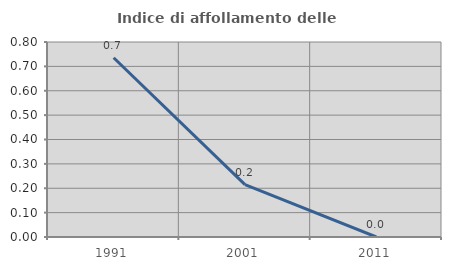
| Category | Indice di affollamento delle abitazioni  |
|---|---|
| 1991.0 | 0.735 |
| 2001.0 | 0.215 |
| 2011.0 | 0 |